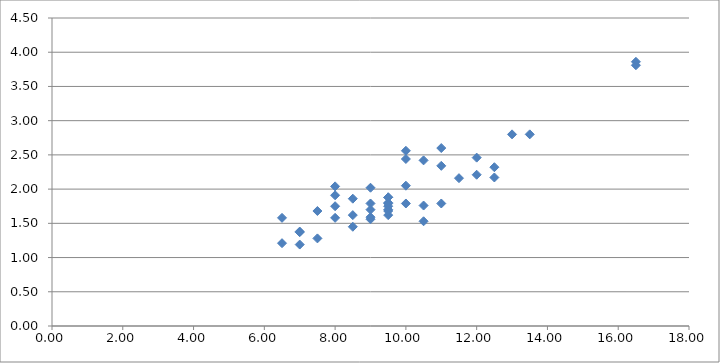
| Category | Series 0 |
|---|---|
| 9.5 | 1.79 |
| 9.5 | 1.7 |
| 13.0 | 2.8 |
| 10.0 | 2.05 |
| 9.0 | 1.56 |
| 9.5 | 1.88 |
| 16.5 | 3.81 |
| 11.0 | 2.6 |
| 8.5 | 1.45 |
| 10.0 | 2.44 |
| 10.5 | 1.53 |
| 10.0 | 2.56 |
| 9.0 | 2.02 |
| 9.0 | 1.7 |
| 6.5 | 1.21 |
| 12.0 | 2.46 |
| 8.0 | 1.75 |
| 9.5 | 1.88 |
| 7.0 | 1.19 |
| 12.0 | 2.21 |
| 11.5 | 2.16 |
| 7.5 | 1.28 |
| 10.0 | 1.79 |
| 9.5 | 1.8 |
| 9.5 | 1.75 |
| 6.5 | 1.58 |
| 7.0 | 1.37 |
| 10.5 | 1.76 |
| 11.0 | 1.79 |
| 12.5 | 2.32 |
| 8.5 | 1.86 |
| 8.5 | 1.62 |
| 9.0 | 1.79 |
| 11.0 | 2.34 |
| 8.0 | 1.91 |
| 8.0 | 1.58 |
| 9.5 | 1.68 |
| 13.5 | 2.8 |
| 9.5 | 1.62 |
| 10.5 | 2.42 |
| 12.5 | 2.17 |
| 7.5 | 1.68 |
| 16.5 | 3.86 |
| 9.0 | 1.59 |
| 7.0 | 1.38 |
| 8.0 | 2.04 |